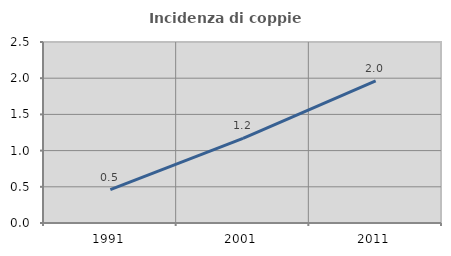
| Category | Incidenza di coppie miste |
|---|---|
| 1991.0 | 0.461 |
| 2001.0 | 1.169 |
| 2011.0 | 1.963 |